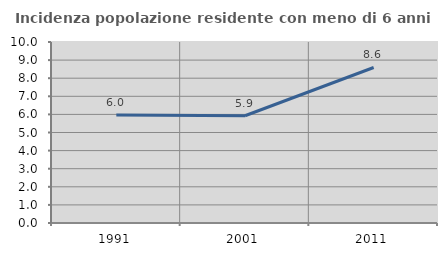
| Category | Incidenza popolazione residente con meno di 6 anni |
|---|---|
| 1991.0 | 5.971 |
| 2001.0 | 5.926 |
| 2011.0 | 8.591 |